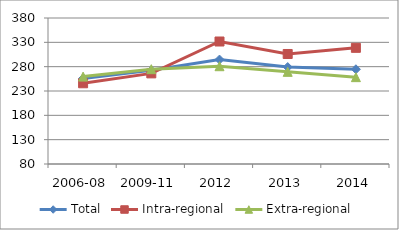
| Category | Total | Intra-regional | Extra-regional |
|---|---|---|---|
| 2006-08 | 255.909 | 245.885 | 259.591 |
| 2009-11 | 272.522 | 266.186 | 274.849 |
| 2012 | 294.569 | 331.693 | 280.932 |
| 2013 | 279.204 | 306.039 | 269.346 |
| 2014 | 274.649 | 318.686 | 258.473 |